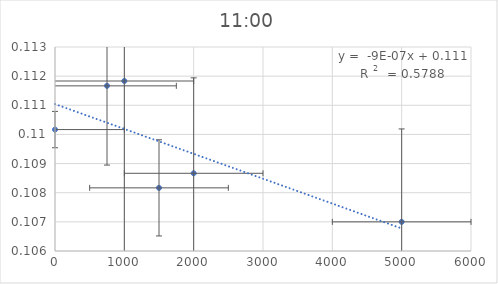
| Category | Series 0 |
|---|---|
| 5000.0 | 0.107 |
| 2000.0 | 0.109 |
| 1500.0 | 0.108 |
| 1000.0 | 0.112 |
| 750.0 | 0.112 |
| 0.0 | 0.11 |